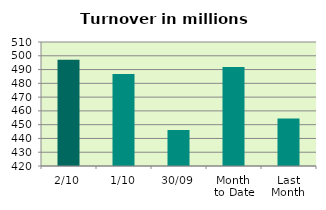
| Category | Series 0 |
|---|---|
| 2/10 | 497.135 |
| 1/10 | 486.751 |
| 30/09 | 446.132 |
| Month 
to Date | 491.943 |
| Last
Month | 454.566 |